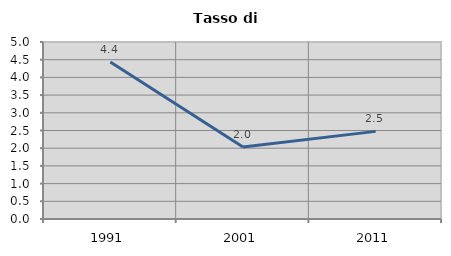
| Category | Tasso di disoccupazione   |
|---|---|
| 1991.0 | 4.438 |
| 2001.0 | 2.036 |
| 2011.0 | 2.476 |